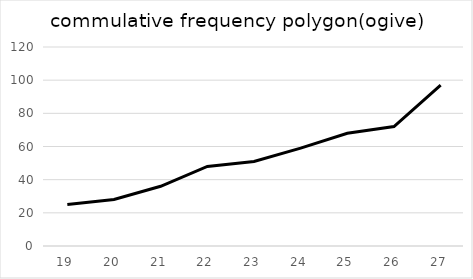
| Category | Series 0 |
|---|---|
| 19.0 | 25 |
| 20.0 | 28 |
| 21.0 | 36 |
| 22.0 | 48 |
| 23.0 | 51 |
| 24.0 | 59 |
| 25.0 | 68 |
| 26.0 | 72 |
| 27.0 | 97 |